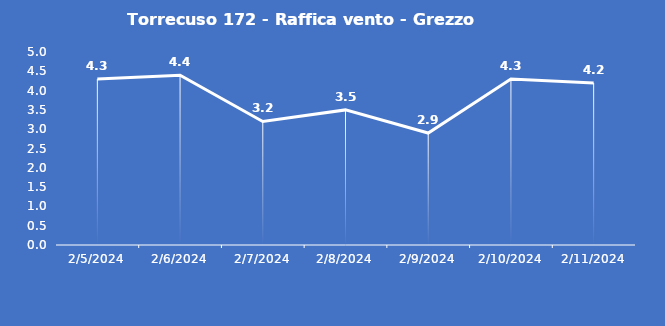
| Category | Torrecuso 172 - Raffica vento - Grezzo (m/s) |
|---|---|
| 2/5/24 | 4.3 |
| 2/6/24 | 4.4 |
| 2/7/24 | 3.2 |
| 2/8/24 | 3.5 |
| 2/9/24 | 2.9 |
| 2/10/24 | 4.3 |
| 2/11/24 | 4.2 |